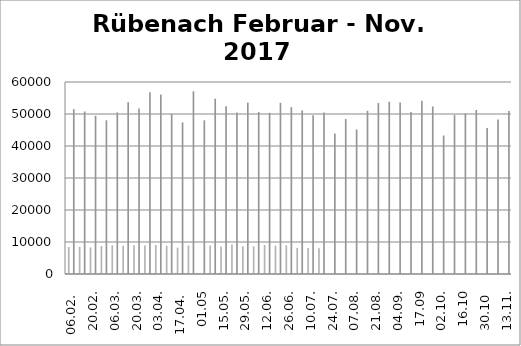
| Category | Rübenach Aachenerstrasse  Februar - Nov. 2017 Max Geschw.  (km/h) | Rübenach Aachenerstrasse  Februar - Nov. 2017 Max   Anzahl / Tag | Rübenach Aachenerstrasse  Februar - Nov. 2017 Verkehrs - reichster  Wochentag  | Rübenach Aachenerstrasse  Februar - Nov. 2017 Reduktion  (km/h) | Rübenach Aachenerstrasse  Februar - Nov. 2017 Total /Woche  |
|---|---|---|---|---|---|
| 06.02.  |  |  |  |  | 51511 |
| 13.02. |  |  |  |  | 50777 |
| 20.02. |  |  |  |  | 49444 |
| 27.02. |  |  |  |  | 48045 |
| 06.03. |  |  |  |  | 50493 |
| 13.03. |  |  |  |  | 53708 |
| 20.03. |  |  |  |  | 51707 |
| 27.03. |  |  |  |  | 56763 |
| 03.04. |  |  |  |  | 56072 |
| 10.04. |  |  |  |  | 50034 |
| 17.04.  |  |  |  |  | 47369 |
| 24.04. |  |  |  |  | 57093 |
| 01.05 |  |  |  |  | 48021 |
| 08.05. |  |  |  |  | 54768 |
| 15.05. |  |  |  |  | 52429 |
| 22.05.  |  |  |  |  | 50469 |
| 29.05. |  |  |  |  | 53559 |
| 05.06.  |  |  |  |  | 50596 |
| 12.06. |  |  |  |  | 50377 |
| 19.06. |  |  |  |  | 53498 |
| 26.06. |  |  |  |  | 52159 |
| 03.07. |  |  |  |  | 51143 |
| 10.07. |  |  |  |  | 49623 |
| 17.07. |  |  |  |  | 50502 |
| 24.07. |  |  |  |  | 43937 |
| 31.07. |  |  |  |  | 48426 |
| 07.08. |  |  |  |  | 45189 |
| 14.08. |  |  |  |  | 50999 |
| 21.08. |  |  |  |  | 53427 |
| 28.08. |  |  |  |  | 53849 |
| 04.09. |  |  |  |  | 53608 |
| 11.09. |  |  |  |  | 50661 |
| 17.09 |  |  |  |  | 54108 |
| 25.09. |  |  |  |  | 52355 |
| 02.10. |  |  |  |  | 43289 |
| 09.10. |  |  |  |  | 49662 |
| 16.10 |  |  |  |  | 50181 |
| 23.10 |  |  |  |  | 51267 |
| 30.10  |  |  |  |  | 45644 |
| 06.11. |  |  |  |  | 48316 |
| 13.11. |  |  |  |  | 50928 |